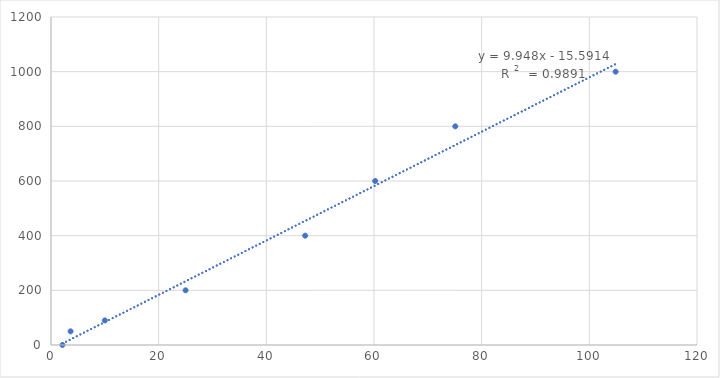
| Category | Concentration (microgram/mL) |
|---|---|
| 2.12 | 0 |
| 10.0 | 90 |
| 25.0 | 200 |
| 47.22 | 400 |
| 75.1 | 800 |
| 104.88 | 1000 |
| 60.22 | 600 |
| 3.64 | 50 |